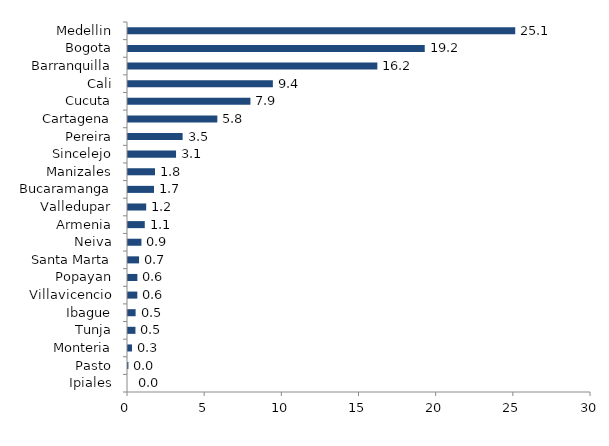
| Category | Series 0 |
|---|---|
| Ipiales | 0 |
| Pasto | 0.027 |
| Monteria | 0.26 |
| Tunja | 0.483 |
| Ibague | 0.494 |
| Villavicencio | 0.605 |
| Popayan | 0.608 |
| Santa Marta | 0.716 |
| Neiva | 0.87 |
| Armenia | 1.087 |
| Valledupar | 1.179 |
| Bucaramanga | 1.686 |
| Manizales | 1.751 |
| Sincelejo | 3.113 |
| Pereira | 3.54 |
| Cartagena | 5.788 |
| Cucuta | 7.933 |
| Cali | 9.386 |
| Barranquilla | 16.156 |
| Bogota | 19.228 |
| Medellin | 25.09 |